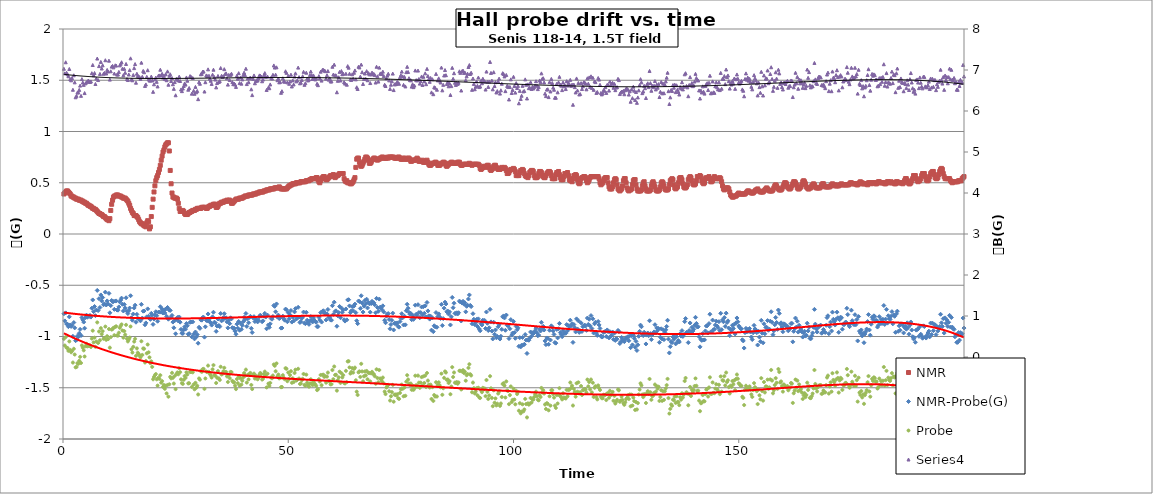
| Category | NMR |
|---|---|
| 0.2 | 0.39 |
| 0.4 | 0.4 |
| 0.6000000000000001 | 0.41 |
| 0.8 | 0.42 |
| 1.0 | 0.42 |
| 1.2 | 0.41 |
| 1.4 | 0.4 |
| 1.5999999999999999 | 0.39 |
| 1.7999999999999998 | 0.37 |
| 1.9999999999999998 | 0.37 |
| 2.1999999999999997 | 0.36 |
| 2.4 | 0.36 |
| 2.6 | 0.35 |
| 2.8000000000000003 | 0.35 |
| 3.0000000000000004 | 0.34 |
| 3.2000000000000006 | 0.34 |
| 3.400000000000001 | 0.34 |
| 3.600000000000001 | 0.33 |
| 3.800000000000001 | 0.33 |
| 4.000000000000001 | 0.33 |
| 4.200000000000001 | 0.32 |
| 4.400000000000001 | 0.32 |
| 4.600000000000001 | 0.31 |
| 4.800000000000002 | 0.31 |
| 5.000000000000002 | 0.3 |
| 5.200000000000002 | 0.3 |
| 5.400000000000002 | 0.29 |
| 5.600000000000002 | 0.28 |
| 5.8000000000000025 | 0.28 |
| 6.000000000000003 | 0.27 |
| 6.200000000000003 | 0.27 |
| 6.400000000000003 | 0.26 |
| 6.600000000000003 | 0.25 |
| 6.800000000000003 | 0.25 |
| 7.0000000000000036 | 0.24 |
| 7.200000000000004 | 0.24 |
| 7.400000000000004 | 0.23 |
| 7.600000000000004 | 0.22 |
| 7.800000000000004 | 0.21 |
| 8.000000000000004 | 0.2 |
| 8.200000000000003 | 0.2 |
| 8.400000000000002 | 0.19 |
| 8.600000000000001 | 0.19 |
| 8.8 | 0.18 |
| 9.0 | 0.17 |
| 9.2 | 0.17 |
| 9.399999999999999 | 0.16 |
| 9.599999999999998 | 0.15 |
| 9.799999999999997 | 0.14 |
| 9.999999999999996 | 0.14 |
| 10.199999999999996 | 0.13 |
| 10.399999999999995 | 0.15 |
| 10.599999999999994 | 0.23 |
| 10.799999999999994 | 0.29 |
| 10.999999999999993 | 0.33 |
| 11.199999999999992 | 0.36 |
| 11.399999999999991 | 0.37 |
| 11.59999999999999 | 0.37 |
| 11.79999999999999 | 0.38 |
| 11.99999999999999 | 0.38 |
| 12.199999999999989 | 0.38 |
| 12.399999999999988 | 0.37 |
| 12.599999999999987 | 0.37 |
| 12.799999999999986 | 0.37 |
| 12.999999999999986 | 0.36 |
| 13.199999999999985 | 0.36 |
| 13.399999999999984 | 0.35 |
| 13.599999999999984 | 0.35 |
| 13.799999999999983 | 0.35 |
| 13.999999999999982 | 0.34 |
| 14.199999999999982 | 0.33 |
| 14.39999999999998 | 0.32 |
| 14.59999999999998 | 0.3 |
| 14.79999999999998 | 0.28 |
| 14.999999999999979 | 0.25 |
| 15.199999999999978 | 0.23 |
| 15.399999999999977 | 0.21 |
| 15.599999999999977 | 0.2 |
| 15.799999999999976 | 0.18 |
| 15.999999999999975 | 0.18 |
| 16.199999999999974 | 0.18 |
| 16.399999999999974 | 0.17 |
| 16.599999999999973 | 0.16 |
| 16.799999999999972 | 0.14 |
| 16.99999999999997 | 0.12 |
| 17.19999999999997 | 0.11 |
| 17.39999999999997 | 0.1 |
| 17.59999999999997 | 0.1 |
| 17.79999999999997 | 0.09 |
| 17.999999999999968 | 0.08 |
| 18.199999999999967 | 0.08 |
| 18.399999999999967 | 0.07 |
| 18.599999999999966 | 0.11 |
| 18.799999999999965 | 0.13 |
| 18.999999999999964 | 0.12 |
| 19.199999999999964 | 0.05 |
| 19.399999999999963 | 0.07 |
| 19.599999999999962 | 0.17 |
| 19.79999999999996 | 0.26 |
| 19.99999999999996 | 0.34 |
| 20.19999999999996 | 0.41 |
| 20.39999999999996 | 0.47 |
| 20.59999999999996 | 0.52 |
| 20.799999999999958 | 0.55 |
| 20.999999999999957 | 0.57 |
| 21.199999999999957 | 0.6 |
| 21.399999999999956 | 0.63 |
| 21.599999999999955 | 0.67 |
| 21.799999999999955 | 0.72 |
| 21.999999999999954 | 0.76 |
| 22.199999999999953 | 0.8 |
| 22.399999999999952 | 0.82 |
| 22.59999999999995 | 0.85 |
| 22.79999999999995 | 0.87 |
| 22.99999999999995 | 0.88 |
| 23.19999999999995 | 0.89 |
| 23.39999999999995 | 0.89 |
| 23.599999999999948 | 0.81 |
| 23.799999999999947 | 0.62 |
| 23.999999999999947 | 0.49 |
| 24.199999999999946 | 0.4 |
| 24.399999999999945 | 0.36 |
| 24.599999999999945 | 0.36 |
| 24.799999999999944 | 0.35 |
| 24.999999999999943 | 0.35 |
| 25.199999999999942 | 0.35 |
| 25.39999999999994 | 0.34 |
| 25.59999999999994 | 0.3 |
| 25.79999999999994 | 0.25 |
| 25.99999999999994 | 0.22 |
| 26.19999999999994 | 0.22 |
| 26.399999999999938 | 0.22 |
| 26.599999999999937 | 0.23 |
| 26.799999999999937 | 0.22 |
| 26.999999999999936 | 0.2 |
| 27.199999999999935 | 0.19 |
| 27.399999999999935 | 0.19 |
| 27.599999999999934 | 0.19 |
| 27.799999999999933 | 0.2 |
| 27.999999999999932 | 0.21 |
| 28.199999999999932 | 0.21 |
| 28.39999999999993 | 0.22 |
| 28.59999999999993 | 0.22 |
| 28.79999999999993 | 0.23 |
| 28.99999999999993 | 0.23 |
| 29.19999999999993 | 0.23 |
| 29.399999999999928 | 0.24 |
| 29.599999999999927 | 0.24 |
| 29.799999999999926 | 0.25 |
| 29.999999999999925 | 0.25 |
| 30.199999999999925 | 0.25 |
| 30.399999999999924 | 0.25 |
| 30.599999999999923 | 0.25 |
| 30.799999999999923 | 0.26 |
| 30.999999999999922 | 0.26 |
| 31.19999999999992 | 0.26 |
| 31.39999999999992 | 0.26 |
| 31.59999999999992 | 0.26 |
| 31.79999999999992 | 0.25 |
| 31.99999999999992 | 0.25 |
| 32.19999999999992 | 0.26 |
| 32.39999999999992 | 0.27 |
| 32.59999999999992 | 0.27 |
| 32.799999999999926 | 0.28 |
| 32.99999999999993 | 0.28 |
| 33.19999999999993 | 0.28 |
| 33.399999999999935 | 0.29 |
| 33.59999999999994 | 0.29 |
| 33.79999999999994 | 0.29 |
| 33.99999999999994 | 0.26 |
| 34.199999999999946 | 0.26 |
| 34.39999999999995 | 0.27 |
| 34.59999999999995 | 0.29 |
| 34.799999999999955 | 0.3 |
| 34.99999999999996 | 0.3 |
| 35.19999999999996 | 0.31 |
| 35.39999999999996 | 0.31 |
| 35.599999999999966 | 0.31 |
| 35.79999999999997 | 0.32 |
| 35.99999999999997 | 0.32 |
| 36.199999999999974 | 0.32 |
| 36.39999999999998 | 0.33 |
| 36.59999999999998 | 0.32 |
| 36.79999999999998 | 0.33 |
| 36.999999999999986 | 0.33 |
| 37.19999999999999 | 0.32 |
| 37.39999999999999 | 0.3 |
| 37.599999999999994 | 0.3 |
| 37.8 | 0.31 |
| 38.0 | 0.32 |
| 38.2 | 0.33 |
| 38.400000000000006 | 0.34 |
| 38.60000000000001 | 0.34 |
| 38.80000000000001 | 0.34 |
| 39.000000000000014 | 0.34 |
| 39.20000000000002 | 0.35 |
| 39.40000000000002 | 0.35 |
| 39.60000000000002 | 0.35 |
| 39.800000000000026 | 0.35 |
| 40.00000000000003 | 0.36 |
| 40.20000000000003 | 0.36 |
| 40.400000000000034 | 0.37 |
| 40.60000000000004 | 0.37 |
| 40.80000000000004 | 0.37 |
| 41.00000000000004 | 0.37 |
| 41.200000000000045 | 0.38 |
| 41.40000000000005 | 0.38 |
| 41.60000000000005 | 0.38 |
| 41.800000000000054 | 0.38 |
| 42.00000000000006 | 0.38 |
| 42.20000000000006 | 0.39 |
| 42.40000000000006 | 0.39 |
| 42.600000000000065 | 0.39 |
| 42.80000000000007 | 0.39 |
| 43.00000000000007 | 0.4 |
| 43.200000000000074 | 0.4 |
| 43.40000000000008 | 0.4 |
| 43.60000000000008 | 0.41 |
| 43.80000000000008 | 0.41 |
| 44.000000000000085 | 0.41 |
| 44.20000000000009 | 0.41 |
| 44.40000000000009 | 0.41 |
| 44.600000000000094 | 0.42 |
| 44.8000000000001 | 0.42 |
| 45.0000000000001 | 0.42 |
| 45.2000000000001 | 0.43 |
| 45.400000000000105 | 0.43 |
| 45.60000000000011 | 0.43 |
| 45.80000000000011 | 0.43 |
| 46.000000000000114 | 0.44 |
| 46.20000000000012 | 0.44 |
| 46.40000000000012 | 0.44 |
| 46.60000000000012 | 0.44 |
| 46.800000000000125 | 0.44 |
| 47.00000000000013 | 0.45 |
| 47.20000000000013 | 0.45 |
| 47.400000000000134 | 0.45 |
| 47.600000000000136 | 0.45 |
| 47.80000000000014 | 0.45 |
| 48.00000000000014 | 0.46 |
| 48.200000000000145 | 0.45 |
| 48.40000000000015 | 0.44 |
| 48.60000000000015 | 0.44 |
| 48.80000000000015 | 0.44 |
| 49.000000000000156 | 0.44 |
| 49.20000000000016 | 0.44 |
| 49.40000000000016 | 0.44 |
| 49.600000000000165 | 0.44 |
| 49.80000000000017 | 0.45 |
| 50.00000000000017 | 0.46 |
| 50.20000000000017 | 0.47 |
| 50.400000000000176 | 0.47 |
| 50.60000000000018 | 0.48 |
| 50.80000000000018 | 0.48 |
| 51.000000000000185 | 0.49 |
| 51.20000000000019 | 0.49 |
| 51.40000000000019 | 0.49 |
| 51.60000000000019 | 0.49 |
| 51.800000000000196 | 0.5 |
| 52.0000000000002 | 0.5 |
| 52.2000000000002 | 0.5 |
| 52.400000000000205 | 0.5 |
| 52.60000000000021 | 0.5 |
| 52.80000000000021 | 0.51 |
| 53.00000000000021 | 0.51 |
| 53.200000000000216 | 0.51 |
| 53.40000000000022 | 0.51 |
| 53.60000000000022 | 0.51 |
| 53.800000000000225 | 0.51 |
| 54.00000000000023 | 0.52 |
| 54.20000000000023 | 0.52 |
| 54.40000000000023 | 0.52 |
| 54.600000000000236 | 0.52 |
| 54.80000000000024 | 0.53 |
| 55.00000000000024 | 0.53 |
| 55.200000000000244 | 0.54 |
| 55.40000000000025 | 0.54 |
| 55.60000000000025 | 0.54 |
| 55.80000000000025 | 0.54 |
| 56.000000000000256 | 0.54 |
| 56.20000000000026 | 0.55 |
| 56.40000000000026 | 0.55 |
| 56.600000000000264 | 0.53 |
| 56.80000000000027 | 0.51 |
| 57.00000000000027 | 0.5 |
| 57.20000000000027 | 0.52 |
| 57.400000000000276 | 0.54 |
| 57.60000000000028 | 0.55 |
| 57.80000000000028 | 0.56 |
| 58.000000000000284 | 0.56 |
| 58.20000000000029 | 0.54 |
| 58.40000000000029 | 0.53 |
| 58.60000000000029 | 0.53 |
| 58.800000000000296 | 0.54 |
| 59.0000000000003 | 0.55 |
| 59.2000000000003 | 0.56 |
| 59.400000000000304 | 0.57 |
| 59.60000000000031 | 0.56 |
| 59.80000000000031 | 0.57 |
| 60.00000000000031 | 0.58 |
| 60.200000000000315 | 0.57 |
| 60.40000000000032 | 0.55 |
| 60.60000000000032 | 0.56 |
| 60.800000000000324 | 0.57 |
| 61.00000000000033 | 0.57 |
| 61.20000000000033 | 0.58 |
| 61.40000000000033 | 0.59 |
| 61.600000000000335 | 0.59 |
| 61.80000000000034 | 0.59 |
| 62.00000000000034 | 0.59 |
| 62.200000000000344 | 0.59 |
| 62.40000000000035 | 0.54 |
| 62.60000000000035 | 0.52 |
| 62.80000000000035 | 0.51 |
| 63.000000000000355 | 0.52 |
| 63.20000000000036 | 0.5 |
| 63.40000000000036 | 0.5 |
| 63.600000000000364 | 0.5 |
| 63.80000000000037 | 0.49 |
| 64.00000000000037 | 0.49 |
| 64.20000000000037 | 0.5 |
| 64.40000000000038 | 0.51 |
| 64.60000000000038 | 0.53 |
| 64.80000000000038 | 0.55 |
| 65.00000000000038 | 0.65 |
| 65.20000000000039 | 0.73 |
| 65.40000000000039 | 0.74 |
| 65.60000000000039 | 0.74 |
| 65.8000000000004 | 0.7 |
| 66.0000000000004 | 0.67 |
| 66.2000000000004 | 0.66 |
| 66.4000000000004 | 0.67 |
| 66.6000000000004 | 0.69 |
| 66.80000000000041 | 0.71 |
| 67.00000000000041 | 0.73 |
| 67.20000000000041 | 0.75 |
| 67.40000000000042 | 0.75 |
| 67.60000000000042 | 0.74 |
| 67.80000000000042 | 0.72 |
| 68.00000000000043 | 0.69 |
| 68.20000000000043 | 0.69 |
| 68.40000000000043 | 0.7 |
| 68.60000000000043 | 0.72 |
| 68.80000000000044 | 0.73 |
| 69.00000000000044 | 0.74 |
| 69.20000000000044 | 0.74 |
| 69.40000000000045 | 0.73 |
| 69.60000000000045 | 0.73 |
| 69.80000000000045 | 0.72 |
| 70.00000000000045 | 0.73 |
| 70.20000000000046 | 0.73 |
| 70.40000000000046 | 0.74 |
| 70.60000000000046 | 0.74 |
| 70.80000000000047 | 0.75 |
| 71.00000000000047 | 0.75 |
| 71.20000000000047 | 0.74 |
| 71.40000000000047 | 0.74 |
| 71.60000000000048 | 0.74 |
| 71.80000000000048 | 0.74 |
| 72.00000000000048 | 0.75 |
| 72.20000000000049 | 0.74 |
| 72.40000000000049 | 0.75 |
| 72.60000000000049 | 0.75 |
| 72.8000000000005 | 0.75 |
| 73.0000000000005 | 0.75 |
| 73.2000000000005 | 0.75 |
| 73.4000000000005 | 0.75 |
| 73.6000000000005 | 0.74 |
| 73.80000000000051 | 0.74 |
| 74.00000000000051 | 0.74 |
| 74.20000000000051 | 0.74 |
| 74.40000000000052 | 0.75 |
| 74.60000000000052 | 0.75 |
| 74.80000000000052 | 0.74 |
| 75.00000000000053 | 0.73 |
| 75.20000000000053 | 0.73 |
| 75.40000000000053 | 0.73 |
| 75.60000000000053 | 0.74 |
| 75.80000000000054 | 0.74 |
| 76.00000000000054 | 0.73 |
| 76.20000000000054 | 0.73 |
| 76.40000000000055 | 0.73 |
| 76.60000000000055 | 0.74 |
| 76.80000000000055 | 0.74 |
| 77.00000000000055 | 0.73 |
| 77.20000000000056 | 0.71 |
| 77.40000000000056 | 0.71 |
| 77.60000000000056 | 0.72 |
| 77.80000000000057 | 0.72 |
| 78.00000000000057 | 0.72 |
| 78.20000000000057 | 0.72 |
| 78.40000000000057 | 0.73 |
| 78.60000000000058 | 0.74 |
| 78.80000000000058 | 0.73 |
| 79.00000000000058 | 0.71 |
| 79.20000000000059 | 0.71 |
| 79.40000000000059 | 0.71 |
| 79.60000000000059 | 0.71 |
| 79.8000000000006 | 0.72 |
| 80.0000000000006 | 0.7 |
| 80.2000000000006 | 0.7 |
| 80.4000000000006 | 0.7 |
| 80.6000000000006 | 0.71 |
| 80.80000000000061 | 0.72 |
| 81.00000000000061 | 0.7 |
| 81.20000000000061 | 0.68 |
| 81.40000000000062 | 0.67 |
| 81.60000000000062 | 0.67 |
| 81.80000000000062 | 0.68 |
| 82.00000000000063 | 0.69 |
| 82.20000000000063 | 0.69 |
| 82.40000000000063 | 0.69 |
| 82.60000000000063 | 0.7 |
| 82.80000000000064 | 0.7 |
| 83.00000000000064 | 0.69 |
| 83.20000000000064 | 0.67 |
| 83.40000000000065 | 0.67 |
| 83.60000000000065 | 0.67 |
| 83.80000000000065 | 0.68 |
| 84.00000000000065 | 0.69 |
| 84.20000000000066 | 0.69 |
| 84.40000000000066 | 0.7 |
| 84.60000000000066 | 0.7 |
| 84.80000000000067 | 0.69 |
| 85.00000000000067 | 0.67 |
| 85.20000000000067 | 0.66 |
| 85.40000000000067 | 0.67 |
| 85.60000000000068 | 0.68 |
| 85.80000000000068 | 0.69 |
| 86.00000000000068 | 0.69 |
| 86.20000000000068 | 0.7 |
| 86.40000000000069 | 0.7 |
| 86.60000000000069 | 0.69 |
| 86.8000000000007 | 0.69 |
| 87.0000000000007 | 0.69 |
| 87.2000000000007 | 0.69 |
| 87.4000000000007 | 0.69 |
| 87.6000000000007 | 0.7 |
| 87.80000000000071 | 0.7 |
| 88.00000000000071 | 0.7 |
| 88.20000000000071 | 0.68 |
| 88.40000000000072 | 0.67 |
| 88.60000000000072 | 0.67 |
| 88.80000000000072 | 0.68 |
| 89.00000000000072 | 0.68 |
| 89.20000000000073 | 0.68 |
| 89.40000000000073 | 0.68 |
| 89.60000000000073 | 0.68 |
| 89.80000000000074 | 0.68 |
| 90.00000000000074 | 0.68 |
| 90.20000000000074 | 0.69 |
| 90.40000000000074 | 0.68 |
| 90.60000000000075 | 0.68 |
| 90.80000000000075 | 0.67 |
| 91.00000000000075 | 0.68 |
| 91.20000000000076 | 0.68 |
| 91.40000000000076 | 0.68 |
| 91.60000000000076 | 0.68 |
| 91.80000000000076 | 0.68 |
| 92.00000000000077 | 0.68 |
| 92.20000000000077 | 0.68 |
| 92.40000000000077 | 0.67 |
| 92.60000000000078 | 0.64 |
| 92.80000000000078 | 0.63 |
| 93.00000000000078 | 0.64 |
| 93.20000000000078 | 0.65 |
| 93.40000000000079 | 0.66 |
| 93.60000000000079 | 0.66 |
| 93.8000000000008 | 0.65 |
| 94.0000000000008 | 0.66 |
| 94.2000000000008 | 0.67 |
| 94.4000000000008 | 0.67 |
| 94.6000000000008 | 0.65 |
| 94.80000000000081 | 0.63 |
| 95.00000000000081 | 0.62 |
| 95.20000000000081 | 0.63 |
| 95.40000000000082 | 0.64 |
| 95.60000000000082 | 0.66 |
| 95.80000000000082 | 0.67 |
| 96.00000000000082 | 0.67 |
| 96.20000000000083 | 0.65 |
| 96.40000000000083 | 0.64 |
| 96.60000000000083 | 0.63 |
| 96.80000000000084 | 0.63 |
| 97.00000000000084 | 0.63 |
| 97.20000000000084 | 0.64 |
| 97.40000000000084 | 0.65 |
| 97.60000000000085 | 0.64 |
| 97.80000000000085 | 0.64 |
| 98.00000000000085 | 0.65 |
| 98.20000000000086 | 0.64 |
| 98.40000000000086 | 0.62 |
| 98.60000000000086 | 0.59 |
| 98.80000000000086 | 0.59 |
| 99.00000000000087 | 0.6 |
| 99.20000000000087 | 0.62 |
| 99.40000000000087 | 0.63 |
| 99.60000000000088 | 0.63 |
| 99.80000000000088 | 0.63 |
| 100.00000000000088 | 0.64 |
| 100.20000000000088 | 0.63 |
| 100.40000000000089 | 0.61 |
| 100.60000000000089 | 0.57 |
| 100.80000000000089 | 0.57 |
| 101.0000000000009 | 0.57 |
| 101.2000000000009 | 0.57 |
| 101.4000000000009 | 0.6 |
| 101.6000000000009 | 0.62 |
| 101.8000000000009 | 0.62 |
| 102.00000000000091 | 0.63 |
| 102.20000000000091 | 0.62 |
| 102.40000000000092 | 0.59 |
| 102.60000000000092 | 0.57 |
| 102.80000000000092 | 0.56 |
| 103.00000000000092 | 0.56 |
| 103.20000000000093 | 0.55 |
| 103.40000000000093 | 0.57 |
| 103.60000000000093 | 0.6 |
| 103.80000000000094 | 0.61 |
| 104.00000000000094 | 0.62 |
| 104.20000000000094 | 0.62 |
| 104.40000000000094 | 0.61 |
| 104.60000000000095 | 0.57 |
| 104.80000000000095 | 0.55 |
| 105.00000000000095 | 0.55 |
| 105.20000000000095 | 0.55 |
| 105.40000000000096 | 0.56 |
| 105.60000000000096 | 0.59 |
| 105.80000000000096 | 0.61 |
| 106.00000000000097 | 0.61 |
| 106.20000000000097 | 0.6 |
| 106.40000000000097 | 0.57 |
| 106.60000000000097 | 0.56 |
| 106.80000000000098 | 0.55 |
| 107.00000000000098 | 0.55 |
| 107.20000000000098 | 0.57 |
| 107.40000000000099 | 0.59 |
| 107.60000000000099 | 0.6 |
| 107.80000000000099 | 0.61 |
| 108.000000000001 | 0.61 |
| 108.200000000001 | 0.6 |
| 108.400000000001 | 0.57 |
| 108.600000000001 | 0.54 |
| 108.800000000001 | 0.54 |
| 109.00000000000101 | 0.54 |
| 109.20000000000101 | 0.54 |
| 109.40000000000101 | 0.58 |
| 109.60000000000102 | 0.6 |
| 109.80000000000102 | 0.6 |
| 110.00000000000102 | 0.61 |
| 110.20000000000103 | 0.58 |
| 110.40000000000103 | 0.55 |
| 110.60000000000103 | 0.53 |
| 110.80000000000103 | 0.53 |
| 111.00000000000104 | 0.53 |
| 111.20000000000104 | 0.56 |
| 111.40000000000104 | 0.59 |
| 111.60000000000105 | 0.59 |
| 111.80000000000105 | 0.59 |
| 112.00000000000105 | 0.6 |
| 112.20000000000105 | 0.57 |
| 112.40000000000106 | 0.53 |
| 112.60000000000106 | 0.52 |
| 112.80000000000106 | 0.52 |
| 113.00000000000107 | 0.51 |
| 113.20000000000107 | 0.54 |
| 113.40000000000107 | 0.57 |
| 113.60000000000107 | 0.57 |
| 113.80000000000108 | 0.58 |
| 114.00000000000108 | 0.57 |
| 114.20000000000108 | 0.53 |
| 114.40000000000109 | 0.5 |
| 114.60000000000109 | 0.49 |
| 114.80000000000109 | 0.5 |
| 115.0000000000011 | 0.54 |
| 115.2000000000011 | 0.55 |
| 115.4000000000011 | 0.55 |
| 115.6000000000011 | 0.56 |
| 115.8000000000011 | 0.56 |
| 116.00000000000111 | 0.55 |
| 116.20000000000111 | 0.52 |
| 116.40000000000111 | 0.5 |
| 116.60000000000112 | 0.51 |
| 116.80000000000112 | 0.53 |
| 117.00000000000112 | 0.55 |
| 117.20000000000113 | 0.56 |
| 117.40000000000113 | 0.56 |
| 117.60000000000113 | 0.56 |
| 117.80000000000113 | 0.56 |
| 118.00000000000114 | 0.56 |
| 118.20000000000114 | 0.56 |
| 118.40000000000114 | 0.56 |
| 118.60000000000115 | 0.56 |
| 118.80000000000115 | 0.56 |
| 119.00000000000115 | 0.54 |
| 119.20000000000115 | 0.5 |
| 119.40000000000116 | 0.48 |
| 119.60000000000116 | 0.49 |
| 119.80000000000116 | 0.5 |
| 120.00000000000117 | 0.52 |
| 120.20000000000117 | 0.54 |
| 120.40000000000117 | 0.55 |
| 120.60000000000117 | 0.55 |
| 120.80000000000118 | 0.55 |
| 121.00000000000118 | 0.5 |
| 121.20000000000118 | 0.46 |
| 121.40000000000119 | 0.44 |
| 121.60000000000119 | 0.44 |
| 121.80000000000119 | 0.44 |
| 122.0000000000012 | 0.46 |
| 122.2000000000012 | 0.5 |
| 122.4000000000012 | 0.53 |
| 122.6000000000012 | 0.54 |
| 122.8000000000012 | 0.53 |
| 123.00000000000121 | 0.48 |
| 123.20000000000121 | 0.44 |
| 123.40000000000121 | 0.43 |
| 123.60000000000122 | 0.42 |
| 123.80000000000122 | 0.43 |
| 124.00000000000122 | 0.44 |
| 124.20000000000122 | 0.47 |
| 124.40000000000123 | 0.52 |
| 124.60000000000123 | 0.54 |
| 124.80000000000123 | 0.54 |
| 125.00000000000124 | 0.5 |
| 125.20000000000124 | 0.45 |
| 125.40000000000124 | 0.43 |
| 125.60000000000124 | 0.42 |
| 125.80000000000125 | 0.43 |
| 126.00000000000125 | 0.43 |
| 126.20000000000125 | 0.44 |
| 126.40000000000126 | 0.48 |
| 126.60000000000126 | 0.52 |
| 126.80000000000126 | 0.53 |
| 127.00000000000126 | 0.53 |
| 127.20000000000127 | 0.48 |
| 127.40000000000127 | 0.44 |
| 127.60000000000127 | 0.42 |
| 127.80000000000128 | 0.42 |
| 128.00000000000128 | 0.42 |
| 128.20000000000127 | 0.42 |
| 128.40000000000126 | 0.43 |
| 128.60000000000124 | 0.47 |
| 128.80000000000123 | 0.5 |
| 129.00000000000122 | 0.51 |
| 129.2000000000012 | 0.47 |
| 129.4000000000012 | 0.44 |
| 129.6000000000012 | 0.42 |
| 129.80000000000118 | 0.42 |
| 130.00000000000117 | 0.42 |
| 130.20000000000115 | 0.42 |
| 130.40000000000114 | 0.43 |
| 130.60000000000113 | 0.47 |
| 130.80000000000112 | 0.5 |
| 131.0000000000011 | 0.51 |
| 131.2000000000011 | 0.49 |
| 131.40000000000109 | 0.46 |
| 131.60000000000107 | 0.43 |
| 131.80000000000106 | 0.42 |
| 132.00000000000105 | 0.42 |
| 132.20000000000104 | 0.42 |
| 132.40000000000103 | 0.43 |
| 132.60000000000102 | 0.46 |
| 132.800000000001 | 0.5 |
| 133.000000000001 | 0.51 |
| 133.20000000000098 | 0.5 |
| 133.40000000000097 | 0.47 |
| 133.60000000000096 | 0.44 |
| 133.80000000000095 | 0.43 |
| 134.00000000000094 | 0.43 |
| 134.20000000000093 | 0.43 |
| 134.40000000000092 | 0.44 |
| 134.6000000000009 | 0.48 |
| 134.8000000000009 | 0.52 |
| 135.00000000000088 | 0.53 |
| 135.20000000000087 | 0.54 |
| 135.40000000000086 | 0.53 |
| 135.60000000000085 | 0.48 |
| 135.80000000000084 | 0.45 |
| 136.00000000000082 | 0.44 |
| 136.2000000000008 | 0.45 |
| 136.4000000000008 | 0.46 |
| 136.6000000000008 | 0.5 |
| 136.80000000000078 | 0.54 |
| 137.00000000000077 | 0.55 |
| 137.20000000000076 | 0.55 |
| 137.40000000000074 | 0.53 |
| 137.60000000000073 | 0.49 |
| 137.80000000000072 | 0.46 |
| 138.0000000000007 | 0.45 |
| 138.2000000000007 | 0.45 |
| 138.4000000000007 | 0.46 |
| 138.60000000000068 | 0.48 |
| 138.80000000000067 | 0.53 |
| 139.00000000000065 | 0.55 |
| 139.20000000000064 | 0.56 |
| 139.40000000000063 | 0.55 |
| 139.60000000000062 | 0.52 |
| 139.8000000000006 | 0.49 |
| 140.0000000000006 | 0.48 |
| 140.20000000000059 | 0.48 |
| 140.40000000000057 | 0.49 |
| 140.60000000000056 | 0.52 |
| 140.80000000000055 | 0.56 |
| 141.00000000000054 | 0.56 |
| 141.20000000000053 | 0.56 |
| 141.40000000000052 | 0.57 |
| 141.6000000000005 | 0.56 |
| 141.8000000000005 | 0.52 |
| 142.00000000000048 | 0.5 |
| 142.20000000000047 | 0.49 |
| 142.40000000000046 | 0.5 |
| 142.60000000000045 | 0.54 |
| 142.80000000000044 | 0.55 |
| 143.00000000000043 | 0.54 |
| 143.20000000000041 | 0.55 |
| 143.4000000000004 | 0.56 |
| 143.6000000000004 | 0.54 |
| 143.80000000000038 | 0.51 |
| 144.00000000000037 | 0.51 |
| 144.20000000000036 | 0.52 |
| 144.40000000000035 | 0.54 |
| 144.60000000000034 | 0.56 |
| 144.80000000000032 | 0.55 |
| 145.0000000000003 | 0.54 |
| 145.2000000000003 | 0.54 |
| 145.4000000000003 | 0.54 |
| 145.60000000000028 | 0.54 |
| 145.80000000000027 | 0.55 |
| 146.00000000000026 | 0.54 |
| 146.20000000000024 | 0.51 |
| 146.40000000000023 | 0.47 |
| 146.60000000000022 | 0.44 |
| 146.8000000000002 | 0.43 |
| 147.0000000000002 | 0.44 |
| 147.2000000000002 | 0.45 |
| 147.40000000000018 | 0.45 |
| 147.60000000000016 | 0.45 |
| 147.80000000000015 | 0.44 |
| 148.00000000000014 | 0.41 |
| 148.20000000000013 | 0.38 |
| 148.40000000000012 | 0.37 |
| 148.6000000000001 | 0.36 |
| 148.8000000000001 | 0.36 |
| 149.00000000000009 | 0.37 |
| 149.20000000000007 | 0.37 |
| 149.40000000000006 | 0.37 |
| 149.60000000000005 | 0.38 |
| 149.80000000000004 | 0.39 |
| 150.00000000000003 | 0.4 |
| 150.20000000000002 | 0.39 |
| 150.4 | 0.39 |
| 150.6 | 0.39 |
| 150.79999999999998 | 0.39 |
| 150.99999999999997 | 0.39 |
| 151.19999999999996 | 0.39 |
| 151.39999999999995 | 0.39 |
| 151.59999999999994 | 0.4 |
| 151.79999999999993 | 0.41 |
| 151.99999999999991 | 0.42 |
| 152.1999999999999 | 0.42 |
| 152.3999999999999 | 0.41 |
| 152.59999999999988 | 0.41 |
| 152.79999999999987 | 0.4 |
| 152.99999999999986 | 0.4 |
| 153.19999999999985 | 0.4 |
| 153.39999999999984 | 0.41 |
| 153.59999999999982 | 0.42 |
| 153.7999999999998 | 0.43 |
| 153.9999999999998 | 0.43 |
| 154.1999999999998 | 0.44 |
| 154.39999999999978 | 0.42 |
| 154.59999999999977 | 0.42 |
| 154.79999999999976 | 0.41 |
| 154.99999999999974 | 0.41 |
| 155.19999999999973 | 0.41 |
| 155.39999999999972 | 0.41 |
| 155.5999999999997 | 0.42 |
| 155.7999999999997 | 0.43 |
| 155.9999999999997 | 0.44 |
| 156.19999999999968 | 0.45 |
| 156.39999999999966 | 0.44 |
| 156.59999999999965 | 0.43 |
| 156.79999999999964 | 0.42 |
| 156.99999999999963 | 0.42 |
| 157.19999999999962 | 0.42 |
| 157.3999999999996 | 0.42 |
| 157.5999999999996 | 0.43 |
| 157.79999999999959 | 0.45 |
| 157.99999999999957 | 0.47 |
| 158.19999999999956 | 0.48 |
| 158.39999999999955 | 0.47 |
| 158.59999999999954 | 0.45 |
| 158.79999999999953 | 0.44 |
| 158.99999999999952 | 0.43 |
| 159.1999999999995 | 0.43 |
| 159.3999999999995 | 0.43 |
| 159.59999999999948 | 0.44 |
| 159.79999999999947 | 0.46 |
| 159.99999999999946 | 0.48 |
| 160.19999999999945 | 0.5 |
| 160.39999999999944 | 0.5 |
| 160.59999999999943 | 0.49 |
| 160.79999999999941 | 0.46 |
| 160.9999999999994 | 0.45 |
| 161.1999999999994 | 0.44 |
| 161.39999999999938 | 0.44 |
| 161.59999999999937 | 0.45 |
| 161.79999999999936 | 0.47 |
| 161.99999999999935 | 0.49 |
| 162.19999999999933 | 0.51 |
| 162.39999999999932 | 0.51 |
| 162.5999999999993 | 0.5 |
| 162.7999999999993 | 0.48 |
| 162.9999999999993 | 0.45 |
| 163.19999999999928 | 0.44 |
| 163.39999999999927 | 0.44 |
| 163.59999999999926 | 0.45 |
| 163.79999999999924 | 0.46 |
| 163.99999999999923 | 0.48 |
| 164.19999999999922 | 0.51 |
| 164.3999999999992 | 0.52 |
| 164.5999999999992 | 0.51 |
| 164.7999999999992 | 0.49 |
| 164.99999999999918 | 0.46 |
| 165.19999999999916 | 0.45 |
| 165.39999999999915 | 0.44 |
| 165.59999999999914 | 0.44 |
| 165.79999999999913 | 0.45 |
| 165.99999999999912 | 0.45 |
| 166.1999999999991 | 0.47 |
| 166.3999999999991 | 0.48 |
| 166.59999999999908 | 0.49 |
| 166.79999999999907 | 0.48 |
| 166.99999999999906 | 0.46 |
| 167.19999999999905 | 0.45 |
| 167.39999999999904 | 0.45 |
| 167.59999999999903 | 0.45 |
| 167.79999999999902 | 0.45 |
| 167.999999999999 | 0.45 |
| 168.199999999999 | 0.46 |
| 168.39999999999898 | 0.48 |
| 168.59999999999897 | 0.49 |
| 168.79999999999896 | 0.49 |
| 168.99999999999895 | 0.47 |
| 169.19999999999894 | 0.46 |
| 169.39999999999893 | 0.46 |
| 169.59999999999891 | 0.46 |
| 169.7999999999989 | 0.46 |
| 169.9999999999989 | 0.46 |
| 170.19999999999888 | 0.46 |
| 170.39999999999887 | 0.47 |
| 170.59999999999886 | 0.48 |
| 170.79999999999885 | 0.49 |
| 170.99999999999883 | 0.48 |
| 171.19999999999882 | 0.47 |
| 171.3999999999988 | 0.48 |
| 171.5999999999988 | 0.47 |
| 171.7999999999988 | 0.47 |
| 171.99999999999878 | 0.47 |
| 172.19999999999877 | 0.47 |
| 172.39999999999876 | 0.48 |
| 172.59999999999874 | 0.48 |
| 172.79999999999873 | 0.49 |
| 172.99999999999872 | 0.48 |
| 173.1999999999987 | 0.48 |
| 173.3999999999987 | 0.48 |
| 173.5999999999987 | 0.48 |
| 173.79999999999868 | 0.48 |
| 173.99999999999866 | 0.48 |
| 174.19999999999865 | 0.48 |
| 174.39999999999864 | 0.48 |
| 174.59999999999863 | 0.49 |
| 174.79999999999862 | 0.5 |
| 174.9999999999986 | 0.5 |
| 175.1999999999986 | 0.49 |
| 175.39999999999858 | 0.49 |
| 175.59999999999857 | 0.49 |
| 175.79999999999856 | 0.49 |
| 175.99999999999855 | 0.49 |
| 176.19999999999854 | 0.48 |
| 176.39999999999853 | 0.48 |
| 176.59999999999852 | 0.49 |
| 176.7999999999985 | 0.5 |
| 176.9999999999985 | 0.51 |
| 177.19999999999848 | 0.49 |
| 177.39999999999847 | 0.5 |
| 177.59999999999846 | 0.49 |
| 177.79999999999845 | 0.49 |
| 177.99999999999844 | 0.49 |
| 178.19999999999843 | 0.49 |
| 178.3999999999984 | 0.49 |
| 178.5999999999984 | 0.48 |
| 178.7999999999984 | 0.5 |
| 178.99999999999838 | 0.5 |
| 179.19999999999837 | 0.5 |
| 179.39999999999836 | 0.49 |
| 179.59999999999835 | 0.5 |
| 179.79999999999833 | 0.5 |
| 179.99999999999832 | 0.5 |
| 180.1999999999983 | 0.5 |
| 180.3999999999983 | 0.49 |
| 180.5999999999983 | 0.49 |
| 180.79999999999828 | 0.5 |
| 180.99999999999827 | 0.51 |
| 181.19999999999825 | 0.51 |
| 181.39999999999824 | 0.5 |
| 181.59999999999823 | 0.5 |
| 181.79999999999822 | 0.5 |
| 181.9999999999982 | 0.5 |
| 182.1999999999982 | 0.5 |
| 182.3999999999982 | 0.49 |
| 182.59999999999818 | 0.49 |
| 182.79999999999816 | 0.5 |
| 182.99999999999815 | 0.51 |
| 183.19999999999814 | 0.51 |
| 183.39999999999813 | 0.5 |
| 183.59999999999812 | 0.5 |
| 183.7999999999981 | 0.51 |
| 183.9999999999981 | 0.5 |
| 184.19999999999808 | 0.5 |
| 184.39999999999807 | 0.5 |
| 184.59999999999806 | 0.49 |
| 184.79999999999805 | 0.49 |
| 184.99999999999804 | 0.51 |
| 185.19999999999803 | 0.51 |
| 185.39999999999802 | 0.5 |
| 185.599999999998 | 0.5 |
| 185.799999999998 | 0.5 |
| 185.99999999999798 | 0.5 |
| 186.19999999999797 | 0.5 |
| 186.39999999999796 | 0.49 |
| 186.59999999999795 | 0.5 |
| 186.79999999999794 | 0.52 |
| 186.99999999999793 | 0.54 |
| 187.1999999999979 | 0.54 |
| 187.3999999999979 | 0.52 |
| 187.5999999999979 | 0.5 |
| 187.79999999999788 | 0.49 |
| 187.99999999999787 | 0.49 |
| 188.19999999999786 | 0.5 |
| 188.39999999999785 | 0.52 |
| 188.59999999999783 | 0.54 |
| 188.79999999999782 | 0.57 |
| 188.9999999999978 | 0.57 |
| 189.1999999999978 | 0.57 |
| 189.3999999999978 | 0.54 |
| 189.59999999999778 | 0.52 |
| 189.79999999999777 | 0.51 |
| 189.99999999999775 | 0.52 |
| 190.19999999999774 | 0.52 |
| 190.39999999999773 | 0.54 |
| 190.59999999999772 | 0.57 |
| 190.7999999999977 | 0.59 |
| 190.9999999999977 | 0.59 |
| 191.1999999999977 | 0.59 |
| 191.39999999999768 | 0.56 |
| 191.59999999999766 | 0.53 |
| 191.79999999999765 | 0.52 |
| 191.99999999999764 | 0.52 |
| 192.19999999999763 | 0.53 |
| 192.39999999999762 | 0.56 |
| 192.5999999999976 | 0.59 |
| 192.7999999999976 | 0.6 |
| 192.99999999999758 | 0.61 |
| 193.19999999999757 | 0.61 |
| 193.39999999999756 | 0.58 |
| 193.59999999999755 | 0.55 |
| 193.79999999999754 | 0.54 |
| 193.99999999999753 | 0.54 |
| 194.19999999999752 | 0.55 |
| 194.3999999999975 | 0.58 |
| 194.5999999999975 | 0.61 |
| 194.79999999999748 | 0.63 |
| 194.99999999999747 | 0.64 |
| 195.19999999999746 | 0.63 |
| 195.39999999999745 | 0.59 |
| 195.59999999999744 | 0.56 |
| 195.79999999999742 | 0.54 |
| 195.9999999999974 | 0.54 |
| 196.1999999999974 | 0.54 |
| 196.3999999999974 | 0.54 |
| 196.59999999999738 | 0.54 |
| 196.79999999999737 | 0.54 |
| 196.99999999999736 | 0.52 |
| 197.19999999999735 | 0.51 |
| 197.39999999999733 | 0.5 |
| 197.59999999999732 | 0.51 |
| 197.7999999999973 | 0.51 |
| 197.9999999999973 | 0.51 |
| 198.1999999999973 | 0.51 |
| 198.39999999999728 | 0.51 |
| 198.59999999999727 | 0.51 |
| 198.79999999999725 | 0.52 |
| 198.99999999999724 | 0.52 |
| 199.19999999999723 | 0.52 |
| 199.39999999999722 | 0.52 |
| 199.5999999999972 | 0.54 |
| 199.7999999999972 | 0.55 |
| 199.9999999999972 | 0.56 |